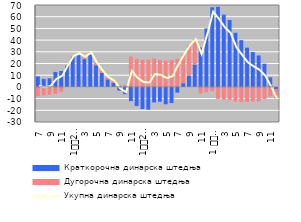
| Category | Краткорочна динарска штедња | Дугорочна динарска штедња |
|---|---|---|
| 7 | 8.967 | -8.007 |
| 8 | 6.881 | -7.127 |
| 9 | 7.334 | -6.641 |
| 10 | 12.813 | -6.007 |
| 11 | 13.648 | -4.166 |
| 12 | 18.05 | 0.294 |
| 1
2010. | 25.514 | 1.025 |
| 2 | 27.133 | 1.63 |
| 3 | 23.763 | 1.853 |
| 4 | 27.466 | 2.243 |
| 5 | 18.567 | 2.036 |
| 6 | 11.917 | 1.974 |
| 7 | 6.511 | 1.776 |
| 8 | 3.395 | 1.779 |
| 9 | -3.175 | 1.796 |
| 10 | -6.226 | 1.732 |
| 11 | -12.197 | 26.048 |
| 12 | -16.272 | 23.969 |
| 1
2011. | -18.953 | 23.187 |
| 2 | -19.451 | 23.151 |
| 3 | -13.279 | 24.31 |
| 4 | -12.705 | 22.948 |
| 5 | -14.873 | 22.418 |
| 6 | -13.828 | 22.982 |
| 7 | -4.9 | 24.093 |
| 8 | 3.184 | 24.616 |
| 9 | 9.636 | 25.772 |
| 10 | 19.032 | 21.942 |
| 11 | 33.693 | -5.515 |
| 12 | 49.999 | -4.559 |
| 1 
2012. | 68.061 | -3.733 |
| 2 | 68.514 | -10.31 |
| 3 | 61.829 | -10.877 |
| 4 | 57.182 | -11.055 |
| 5 | 46.29 | -12.401 |
| 6 | 39.941 | -12.695 |
| 7 | 33.564 | -12.787 |
| 8 | 29.796 | -12.282 |
| 9 | 26.872 | -12.312 |
| 10 | 19.835 | -10.423 |
| 11 | 8.184 | -8.106 |
| 12 | -1.74 | -8.274 |